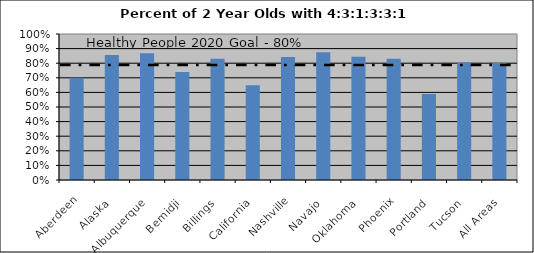
| Category | Percent with 4:3:1:3:3:1 |
|---|---|
| Aberdeen | 0.701 |
| Alaska | 0.855 |
| Albuquerque | 0.868 |
| Bemidji | 0.74 |
| Billings | 0.83 |
| California | 0.65 |
| Nashville | 0.842 |
| Navajo | 0.875 |
| Oklahoma | 0.844 |
| Phoenix | 0.83 |
| Portland | 0.589 |
| Tucson | 0.802 |
| All Areas | 0.801 |